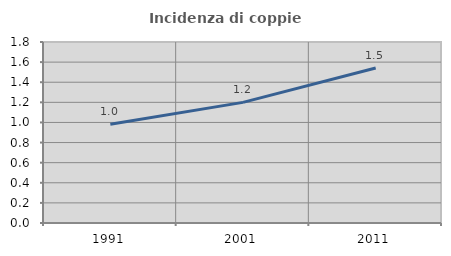
| Category | Incidenza di coppie miste |
|---|---|
| 1991.0 | 0.982 |
| 2001.0 | 1.199 |
| 2011.0 | 1.541 |